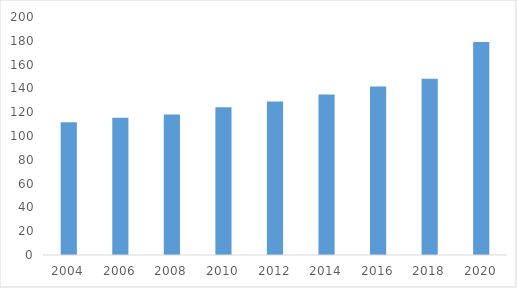
| Category | Deaths / Funeral Home |
|---|---|
| 2004.0 | 111.483 |
| 2006.0 | 115.231 |
| 2008.0 | 118.097 |
| 2010.0 | 124.108 |
| 2012.0 | 129.065 |
| 2014.0 | 134.969 |
| 2016.0 | 141.587 |
| 2018.0 | 148.094 |
| 2020.0 | 179.082 |